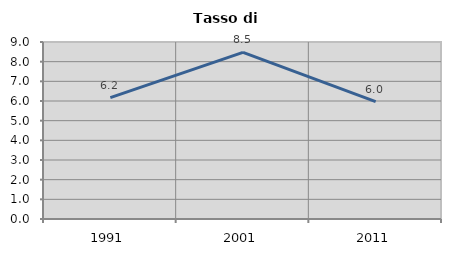
| Category | Tasso di disoccupazione   |
|---|---|
| 1991.0 | 6.173 |
| 2001.0 | 8.475 |
| 2011.0 | 5.97 |